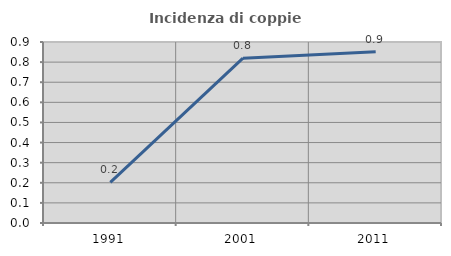
| Category | Incidenza di coppie miste |
|---|---|
| 1991.0 | 0.202 |
| 2001.0 | 0.82 |
| 2011.0 | 0.852 |